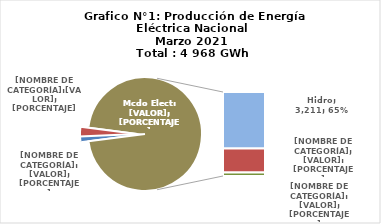
| Category | Series 0 |
|---|---|
| 0 | 67.985 |
| 1 | 134.955 |
| 2 | 3211.056 |
| 3 | 1353.858 |
| 4 | 199.712 |